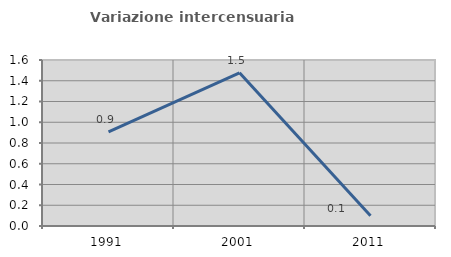
| Category | Variazione intercensuaria annua |
|---|---|
| 1991.0 | 0.908 |
| 2001.0 | 1.476 |
| 2011.0 | 0.099 |